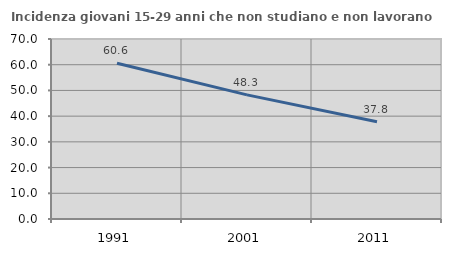
| Category | Incidenza giovani 15-29 anni che non studiano e non lavorano  |
|---|---|
| 1991.0 | 60.55 |
| 2001.0 | 48.261 |
| 2011.0 | 37.818 |